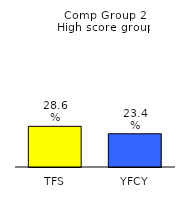
| Category | Series 0 |
|---|---|
| TFS | 0.286 |
| YFCY | 0.234 |